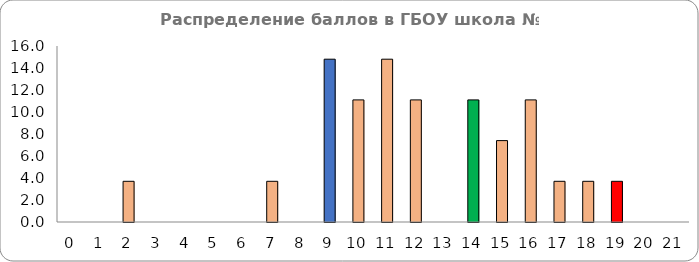
| Category | Series 0 |
|---|---|
| 0.0 | 0 |
| 1.0 | 0 |
| 2.0 | 3.7 |
| 3.0 | 0 |
| 4.0 | 0 |
| 5.0 | 0 |
| 6.0 | 0 |
| 7.0 | 3.7 |
| 8.0 | 0 |
| 9.0 | 14.8 |
| 10.0 | 11.1 |
| 11.0 | 14.8 |
| 12.0 | 11.1 |
| 13.0 | 0 |
| 14.0 | 11.1 |
| 15.0 | 7.4 |
| 16.0 | 11.1 |
| 17.0 | 3.7 |
| 18.0 | 3.7 |
| 19.0 | 3.7 |
| 20.0 | 0 |
| 21.0 | 0 |